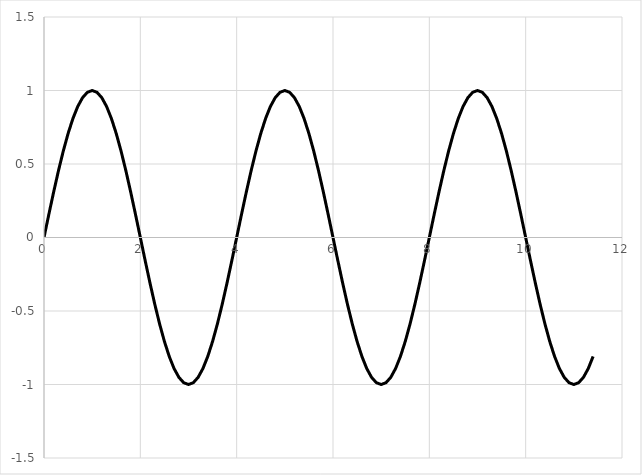
| Category | Series 0 |
|---|---|
| 0.0 | 0 |
| 0.1 | 0.156 |
| 0.2 | 0.309 |
| 0.3 | 0.454 |
| 0.4 | 0.588 |
| 0.5 | 0.707 |
| 0.6 | 0.809 |
| 0.7 | 0.891 |
| 0.8 | 0.951 |
| 0.9 | 0.988 |
| 1.0 | 1 |
| 1.1 | 0.988 |
| 1.2 | 0.951 |
| 1.3 | 0.891 |
| 1.4 | 0.809 |
| 1.5 | 0.707 |
| 1.6 | 0.588 |
| 1.7 | 0.454 |
| 1.8 | 0.309 |
| 1.900000000000001 | 0.156 |
| 2.0 | 0 |
| 2.100000000000001 | -0.156 |
| 2.200000000000001 | -0.309 |
| 2.300000000000001 | -0.454 |
| 2.400000000000001 | -0.588 |
| 2.500000000000001 | -0.707 |
| 2.600000000000001 | -0.809 |
| 2.700000000000001 | -0.891 |
| 2.800000000000001 | -0.951 |
| 2.900000000000001 | -0.988 |
| 3.000000000000001 | -1 |
| 3.100000000000001 | -0.988 |
| 3.200000000000001 | -0.951 |
| 3.300000000000002 | -0.891 |
| 3.400000000000002 | -0.809 |
| 3.500000000000002 | -0.707 |
| 3.600000000000002 | -0.588 |
| 3.700000000000002 | -0.454 |
| 3.800000000000002 | -0.309 |
| 3.900000000000002 | -0.156 |
| 4.000000000000002 | 0 |
| 4.100000000000001 | 0.156 |
| 4.200000000000001 | 0.309 |
| 4.300000000000001 | 0.454 |
| 4.4 | 0.588 |
| 4.5 | 0.707 |
| 4.6 | 0.809 |
| 4.699999999999999 | 0.891 |
| 4.799999999999999 | 0.951 |
| 4.899999999999999 | 0.988 |
| 4.999999999999998 | 1 |
| 5.099999999999998 | 0.988 |
| 5.199999999999997 | 0.951 |
| 5.299999999999997 | 0.891 |
| 5.399999999999997 | 0.809 |
| 5.499999999999996 | 0.707 |
| 5.599999999999996 | 0.588 |
| 5.699999999999996 | 0.454 |
| 5.799999999999995 | 0.309 |
| 5.899999999999995 | 0.156 |
| 5.999999999999994 | 0 |
| 6.099999999999994 | -0.156 |
| 6.199999999999994 | -0.309 |
| 6.299999999999994 | -0.454 |
| 6.399999999999993 | -0.588 |
| 6.499999999999993 | -0.707 |
| 6.599999999999993 | -0.809 |
| 6.699999999999992 | -0.891 |
| 6.799999999999992 | -0.951 |
| 6.899999999999991 | -0.988 |
| 6.999999999999991 | -1 |
| 7.099999999999991 | -0.988 |
| 7.19999999999999 | -0.951 |
| 7.29999999999999 | -0.891 |
| 7.39999999999999 | -0.809 |
| 7.49999999999999 | -0.707 |
| 7.599999999999989 | -0.588 |
| 7.699999999999989 | -0.454 |
| 7.799999999999988 | -0.309 |
| 7.899999999999988 | -0.156 |
| 7.999999999999987 | 0 |
| 8.099999999999987 | 0.156 |
| 8.199999999999987 | 0.309 |
| 8.299999999999986 | 0.454 |
| 8.399999999999986 | 0.588 |
| 8.499999999999986 | 0.707 |
| 8.599999999999985 | 0.809 |
| 8.699999999999983 | 0.891 |
| 8.799999999999985 | 0.951 |
| 8.899999999999984 | 0.988 |
| 8.999999999999982 | 1 |
| 9.099999999999984 | 0.988 |
| 9.199999999999983 | 0.951 |
| 9.299999999999981 | 0.891 |
| 9.39999999999998 | 0.809 |
| 9.49999999999998 | 0.707 |
| 9.59999999999998 | 0.588 |
| 9.69999999999998 | 0.454 |
| 9.79999999999998 | 0.309 |
| 9.89999999999998 | 0.156 |
| 9.99999999999998 | 0 |
| 10.09999999999998 | -0.156 |
| 10.19999999999998 | -0.309 |
| 10.29999999999998 | -0.454 |
| 10.39999999999998 | -0.588 |
| 10.49999999999998 | -0.707 |
| 10.59999999999998 | -0.809 |
| 10.69999999999998 | -0.891 |
| 10.79999999999998 | -0.951 |
| 10.89999999999998 | -0.988 |
| 10.99999999999998 | -1 |
| 11.09999999999998 | -0.988 |
| 11.19999999999998 | -0.951 |
| 11.29999999999998 | -0.891 |
| 11.39999999999998 | -0.809 |